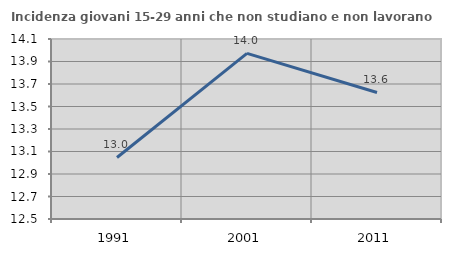
| Category | Incidenza giovani 15-29 anni che non studiano e non lavorano  |
|---|---|
| 1991.0 | 13.047 |
| 2001.0 | 13.972 |
| 2011.0 | 13.625 |